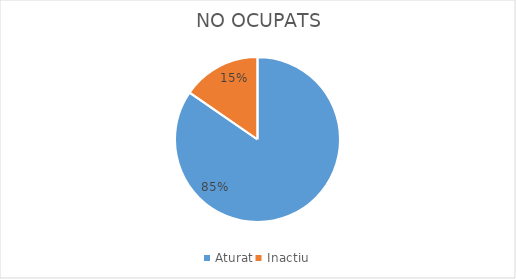
| Category | Series 0 |
|---|---|
| Aturat | 11 |
| Inactiu | 2 |